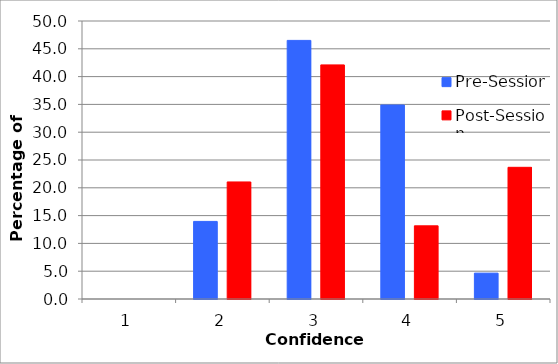
| Category | Pre-Session | Post-Session |
|---|---|---|
| 1.0 | 0 | 0 |
| 2.0 | 13.953 | 21.053 |
| 3.0 | 46.512 | 42.105 |
| 4.0 | 34.884 | 13.158 |
| 5.0 | 4.651 | 23.684 |